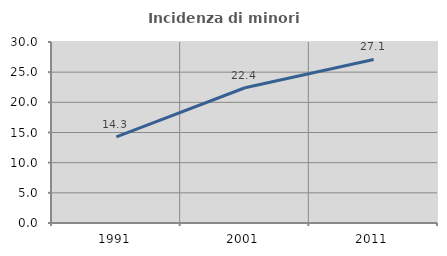
| Category | Incidenza di minori stranieri |
|---|---|
| 1991.0 | 14.286 |
| 2001.0 | 22.414 |
| 2011.0 | 27.113 |